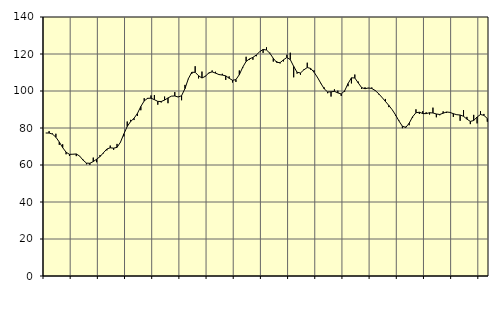
| Category | Piggar | Series 1 |
|---|---|---|
| nan | 77.3 | 77.29 |
| 87.0 | 78.3 | 77.29 |
| 87.0 | 77 | 76.69 |
| 87.0 | 76.9 | 75.03 |
| nan | 70.9 | 72.43 |
| 88.0 | 71.2 | 69.39 |
| 88.0 | 65.8 | 66.92 |
| 88.0 | 64.9 | 65.76 |
| nan | 65.9 | 65.83 |
| 89.0 | 64.8 | 65.97 |
| 89.0 | 64.9 | 64.82 |
| 89.0 | 62.9 | 62.62 |
| nan | 60.4 | 61.03 |
| 90.0 | 60.1 | 60.93 |
| 90.0 | 64 | 61.85 |
| 90.0 | 61.5 | 63.13 |
| nan | 65.4 | 64.56 |
| 91.0 | 66.3 | 66.62 |
| 91.0 | 67.9 | 68.63 |
| 91.0 | 70.5 | 69.3 |
| nan | 68.2 | 69.1 |
| 92.0 | 71.4 | 69.54 |
| 92.0 | 72.4 | 72.28 |
| 92.0 | 75.5 | 76.78 |
| nan | 83.5 | 80.84 |
| 93.0 | 84.4 | 83.51 |
| 93.0 | 84.3 | 85.25 |
| 93.0 | 86.5 | 87.85 |
| nan | 89.6 | 91.61 |
| 94.0 | 96.1 | 94.64 |
| 94.0 | 95.7 | 96.05 |
| 94.0 | 97.6 | 96.12 |
| nan | 97.8 | 95.32 |
| 95.0 | 92.6 | 94.39 |
| 95.0 | 93.8 | 94.31 |
| 95.0 | 97 | 95.1 |
| nan | 93.4 | 96.25 |
| 96.0 | 97.2 | 97.21 |
| 96.0 | 99.4 | 97.32 |
| 96.0 | 96.9 | 96.74 |
| nan | 95 | 97.46 |
| 97.0 | 103.3 | 101.3 |
| 97.0 | 106.4 | 106.66 |
| 97.0 | 109.2 | 110.11 |
| nan | 113.4 | 110.11 |
| 98.0 | 106.8 | 108.25 |
| 98.0 | 110.5 | 107.03 |
| 98.0 | 108.2 | 107.92 |
| nan | 109.5 | 109.81 |
| 99.0 | 111.1 | 110.33 |
| 99.0 | 110.4 | 109.66 |
| 99.0 | 108.7 | 108.89 |
| nan | 109.3 | 108.61 |
| 0.0 | 106 | 108.18 |
| 0.0 | 107.9 | 106.9 |
| 0.0 | 104.6 | 105.77 |
| nan | 104.9 | 106.18 |
| 1.0 | 111.1 | 108.81 |
| 1.0 | 112.4 | 112.87 |
| 1.0 | 118.5 | 116 |
| nan | 116.9 | 117.35 |
| 2.0 | 116.9 | 118.18 |
| 2.0 | 118.8 | 119.46 |
| 2.0 | 121.2 | 121.23 |
| nan | 120.6 | 122.47 |
| 3.0 | 123.6 | 122.15 |
| 3.0 | 120.7 | 120.38 |
| 3.0 | 115.9 | 117.66 |
| nan | 116.2 | 115.48 |
| 4.0 | 114.9 | 115.33 |
| 4.0 | 116 | 116.84 |
| 4.0 | 119.6 | 118.15 |
| nan | 120.7 | 116.96 |
| 5.0 | 107.4 | 113.31 |
| 5.0 | 109.4 | 110.12 |
| 5.0 | 108.8 | 109.76 |
| nan | 111.7 | 111.43 |
| 6.0 | 115.3 | 112.68 |
| 6.0 | 111.5 | 112.2 |
| 6.0 | 111.2 | 110.15 |
| nan | 107.1 | 107.37 |
| 7.0 | 104 | 104.16 |
| 7.0 | 101.9 | 101.14 |
| 7.0 | 98.8 | 99.49 |
| nan | 97 | 99.55 |
| 8.0 | 100.9 | 99.82 |
| 8.0 | 100.2 | 98.97 |
| 8.0 | 97.3 | 98.4 |
| nan | 99.6 | 100.09 |
| 9.0 | 102.6 | 103.99 |
| 9.0 | 104.1 | 107.12 |
| 9.0 | 108.9 | 107.05 |
| nan | 105.1 | 104.4 |
| 10.0 | 101.1 | 101.84 |
| 10.0 | 102 | 101.22 |
| 10.0 | 101.5 | 101.64 |
| nan | 101.9 | 101.37 |
| 11.0 | 100.5 | 100.27 |
| 11.0 | 98.2 | 98.58 |
| 11.0 | 96.5 | 96.55 |
| nan | 95.7 | 94.39 |
| 12.0 | 91.3 | 92.22 |
| 12.0 | 89.9 | 89.89 |
| 12.0 | 86.7 | 87.04 |
| nan | 84 | 83.77 |
| 13.0 | 79.9 | 80.95 |
| 13.0 | 80.7 | 80.31 |
| 13.0 | 81.5 | 82.58 |
| nan | 85.5 | 86.04 |
| 14.0 | 90.1 | 88.26 |
| 14.0 | 87.6 | 88.53 |
| 14.0 | 89.1 | 87.81 |
| nan | 88.5 | 87.77 |
| 15.0 | 87.3 | 88.26 |
| 15.0 | 91 | 88.12 |
| 15.0 | 85.8 | 87.58 |
| nan | 86.9 | 87.31 |
| 16.0 | 89 | 87.99 |
| 16.0 | 88.1 | 88.65 |
| 16.0 | 88.5 | 88.43 |
| nan | 86 | 87.74 |
| 17.0 | 87.3 | 87.18 |
| 17.0 | 83.9 | 87.02 |
| 17.0 | 89.7 | 86.33 |
| nan | 86 | 84.8 |
| 18.0 | 82.1 | 83.57 |
| 18.0 | 87.1 | 84.04 |
| 18.0 | 82.5 | 85.94 |
| nan | 89.1 | 87.29 |
| 19.0 | 87.6 | 86.84 |
| 19.0 | 83.4 | 85.12 |